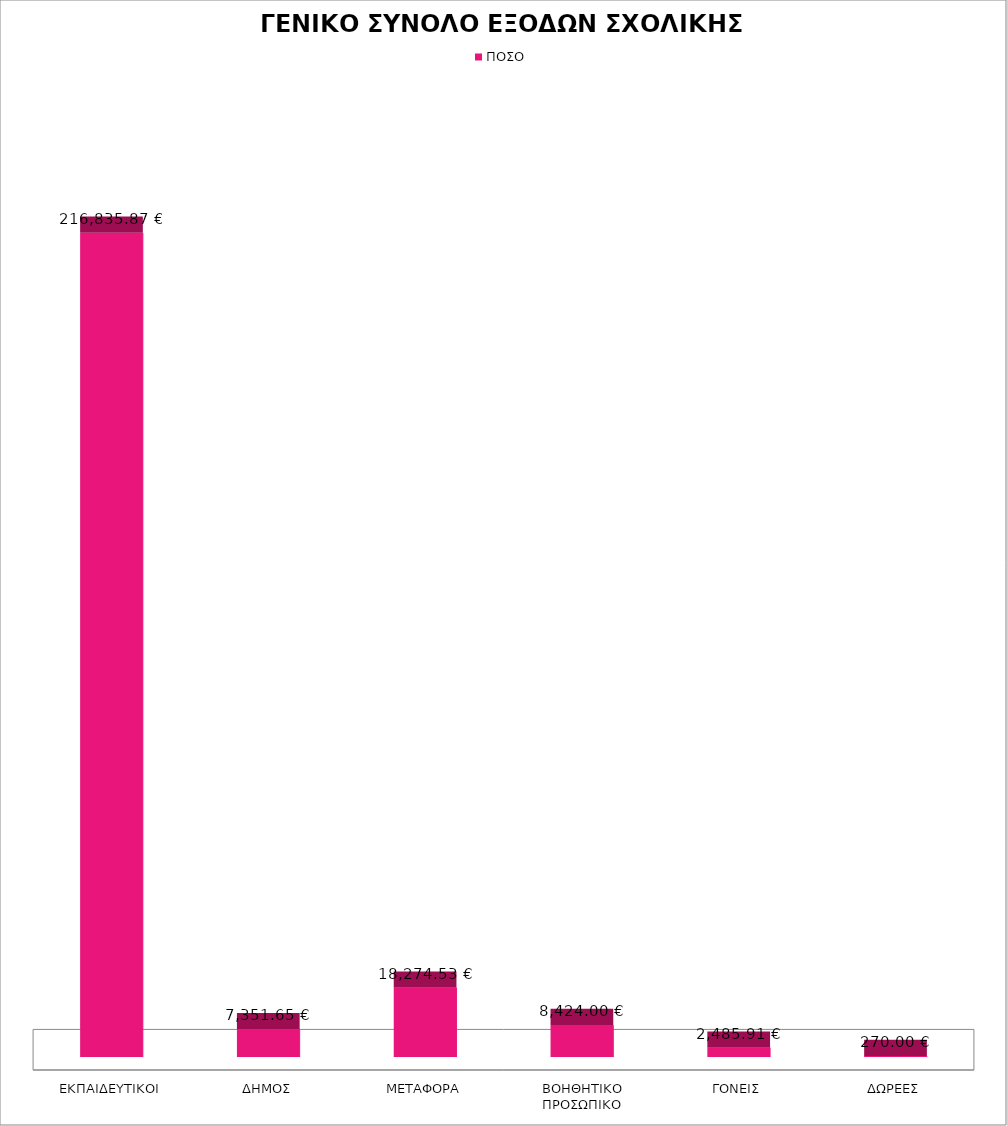
| Category | ΠΟΣΟ |
|---|---|
| ΕΚΠΑΙΔΕΥΤΙΚΟΙ | 216835.87 |
| ΔΗΜΟΣ | 7351.65 |
| ΜΕΤΑΦΟΡΑ | 18274.53 |
| ΒΟΗΘΗΤΙΚΟ ΠΡΟΣΩΠΙΚΟ | 8424 |
| ΓΟΝΕΙΣ | 2485.91 |
| ΔΩΡΕΕΣ | 270 |